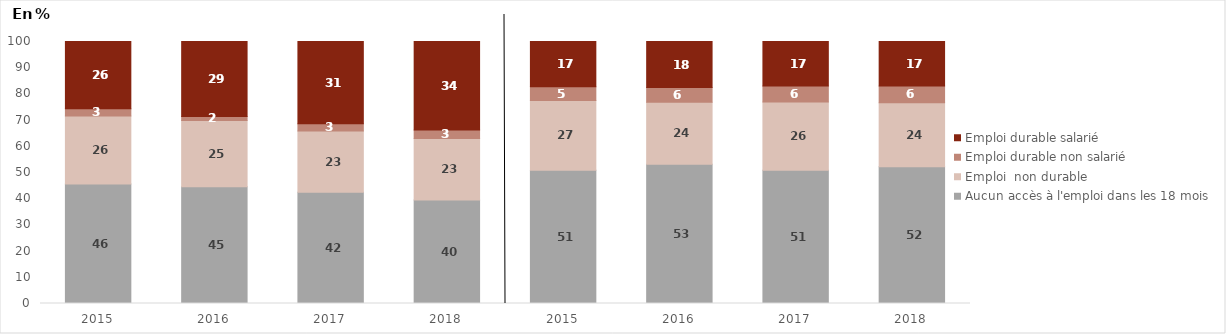
| Category | Aucun accès à l'emploi dans les 18 mois | Emploi  non durable | Emploi durable non salarié | Emploi durable salarié |
|---|---|---|---|---|
| 2015.0 | 45.65 | 25.92 | 2.8 | 25.62 |
| 2016.0 | 44.57 | 25.25 | 1.6 | 28.58 |
| 2017.0 | 42.42 | 23.46 | 2.77 | 31.35 |
| 2018.0 | 39.55 | 23.46 | 3.19 | 33.8 |
| 2015.0 | 50.9 | 26.57 | 5.25 | 17.29 |
| 2016.0 | 53.12 | 23.73 | 5.55 | 17.61 |
| 2017.0 | 50.84 | 26.08 | 6.05 | 17.03 |
| 2018.0 | 52.19 | 24.45 | 6.35 | 17.01 |